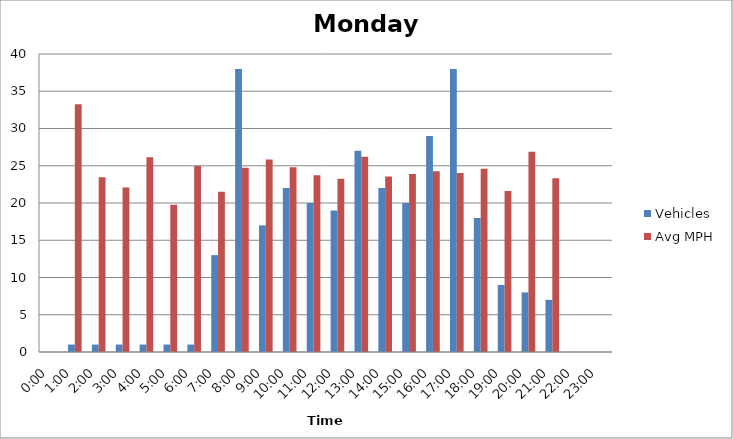
| Category | Vehicles | Avg MPH |
|---|---|---|
| 0:00 | 0 | 0 |
| 1:00 | 1 | 33.24 |
| 2:00 | 1 | 23.45 |
| 3:00 | 1 | 22.08 |
| 4:00 | 1 | 26.15 |
| 5:00 | 1 | 19.78 |
| 6:00 | 1 | 24.98 |
| 7:00 | 13 | 21.52 |
| 8:00 | 38 | 24.72 |
| 9:00 | 17 | 25.83 |
| 10:00 | 22 | 24.8 |
| 11:00 | 20 | 23.74 |
| 12:00 | 19 | 23.27 |
| 13:00 | 27 | 26.2 |
| 14:00 | 22 | 23.55 |
| 15:00 | 20 | 23.88 |
| 16:00 | 29 | 24.25 |
| 17:00 | 38 | 24.04 |
| 18:00 | 18 | 24.59 |
| 19:00 | 9 | 21.61 |
| 20:00 | 8 | 26.87 |
| 21:00 | 7 | 23.33 |
| 22:00 | 0 | 0 |
| 23:00 | 0 | 0 |